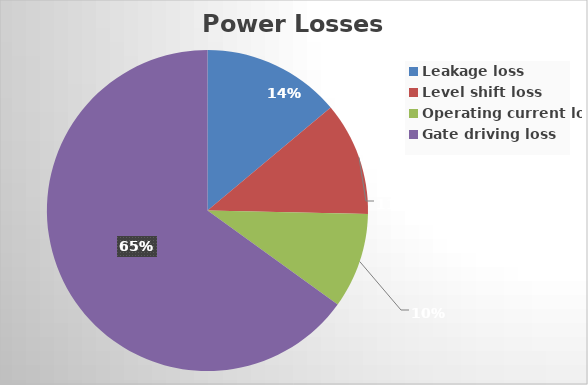
| Category | Series 0 |
|---|---|
| Leakage loss | 20.55 |
| Level shift loss | 16.851 |
| Operating current loss | 14.168 |
| Gate driving loss | 96 |